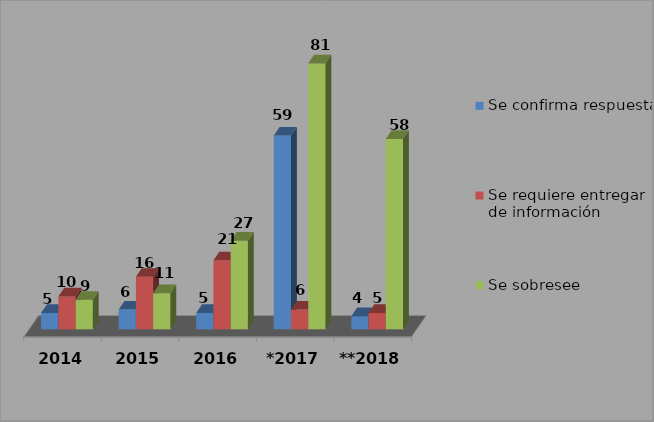
| Category | Se confirma respuesta | Se requiere entregar de información  | Se sobresee  |
|---|---|---|---|
| 2014 | 5 | 10 | 9 |
| 2015 | 6 | 16 | 11 |
| 2016 | 5 | 21 | 27 |
| *2017 | 59 | 6 | 81 |
| **2018 | 4 | 5 | 58 |